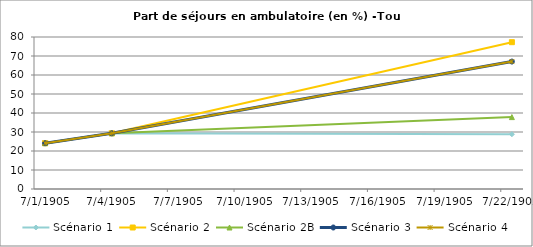
| Category | Scénario 1 | Scénario 2 | Scénario 2B | Scénario 3 | Scénario 4 |
|---|---|---|---|---|---|
| 2009.0 | 24.105 | 24.105 | 24.105 | 24.105 | 24.105 |
| 2012.0 | 29.322 | 29.322 | 29.322 | 29.322 | 29.322 |
| 2030.0 | 28.817 | 77.271 | 37.844 | 67.076 | 67.076 |